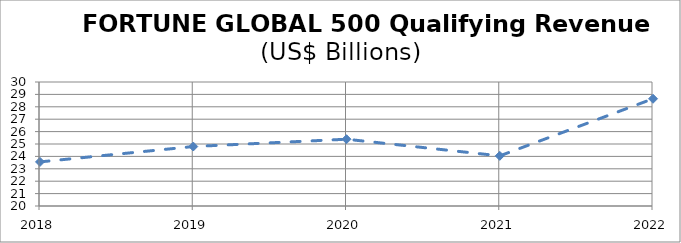
| Category | FORTUNE GLOBAL 500 QUALIFYING REVENUES |
|---|---|
| 2018.0 | 23.556 |
| 2019.0 | 24.796 |
| 2020.0 | 25.386 |
| 2021.0 | 24.043 |
| 2022.0 | 28.649 |